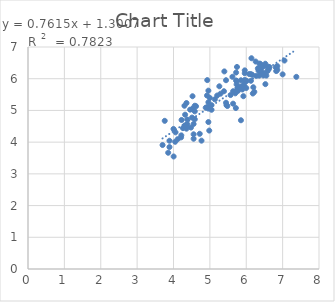
| Category | Series 0 |
|---|---|
| 4.301 | 5.148 |
| 5.77 | 5.615 |
| 5.939 | 5.781 |
| 6.824 | 6.241 |
| 5.569 | 5.485 |
| 6.387 | 6.465 |
| 6.276 | 6.089 |
| 5.959 | 6.173 |
| 5.0 | 5.393 |
| 6.0 | 5.707 |
| 5.201 | 5.469 |
| 5.444 | 5.952 |
| 4.319 | 4.866 |
| 6.167 | 6.121 |
| 5.638 | 5.605 |
| 6.409 | 6.189 |
| 6.502 | 6.173 |
| 6.131 | 6.143 |
| 7.377 | 6.059 |
| 7.0 | 6.137 |
| 6.854 | 6.279 |
| 6.81 | 6.358 |
| 4.357 | 5.234 |
| 4.959 | 5.623 |
| 6.523 | 6.472 |
| 5.721 | 5.944 |
| 6.357 | 6.096 |
| 4.62 | 5.132 |
| 5.699 | 5.539 |
| 6.337 | 6.253 |
| 6.553 | 6.098 |
| 6.319 | 6.327 |
| 5.836 | 5.752 |
| 5.714 | 5.075 |
| 5.893 | 5.661 |
| 4.983 | 4.365 |
| 5.757 | 5.705 |
| 5.735 | 5.819 |
| 6.129 | 5.935 |
| 6.526 | 5.829 |
| 5.959 | 5.889 |
| 4.529 | 5.061 |
| 5.735 | 5.927 |
| 6.081 | 6.147 |
| 6.638 | 6.368 |
| 6.367 | 6.476 |
| 6.398 | 6.431 |
| 7.051 | 6.573 |
| 5.292 | 5.527 |
| 6.222 | 5.585 |
| 6.602 | 6.38 |
| 4.959 | 5.258 |
| 4.921 | 5.47 |
| 6.26 | 6.541 |
| 4.936 | 5.112 |
| 5.638 | 5.213 |
| 4.959 | 5.058 |
| 4.77 | 4.047 |
| 4.509 | 4.774 |
| 4.585 | 5.148 |
| 4.114 | 4.093 |
| 4.046 | 4.011 |
| 3.699 | 3.909 |
| 4.056 | 4.309 |
| 4.886 | 5.088 |
| 4.456 | 5.025 |
| 5.854 | 4.69 |
| 5.456 | 5.168 |
| 5.481 | 5.139 |
| 5.046 | 5.166 |
| 4.523 | 5.036 |
| 4.31 | 4.528 |
| 3.759 | 4.672 |
| 4.721 | 4.263 |
| 4.553 | 4.107 |
| 3.889 | 3.845 |
| 4.004 | 3.548 |
| 4.215 | 4.213 |
| 4.357 | 4.424 |
| 3.889 | 4.044 |
| 4.553 | 4.247 |
| 4.585 | 4.721 |
| 6.013 | 5.933 |
| 5.854 | 5.95 |
| 4.928 | 5.956 |
| 5.745 | 6.371 |
| 5.26 | 5.761 |
| 6.18 | 5.534 |
| 5.444 | 5.242 |
| 6.194 | 5.731 |
| 5.62 | 6.061 |
| 4.377 | 4.715 |
| 3.854 | 3.666 |
| 4.222 | 4.699 |
| 4.553 | 4.573 |
| 5.745 | 5.634 |
| 4.377 | 4.569 |
| 4.959 | 4.634 |
| 4.481 | 4.461 |
| 4.523 | 5.447 |
| 4.208 | 4.15 |
| 5.046 | 5.02 |
| 4.26 | 4.442 |
| 6.469 | 6.101 |
| 5.921 | 5.449 |
| 6.143 | 6.646 |
| 6.854 | 6.397 |
| 6.62 | 6.303 |
| 5.959 | 6.264 |
| 5.398 | 6.23 |
| 6.495 | 6.394 |
| 5.721 | 6.195 |
| 6.456 | 6.395 |
| 6.585 | 6.24 |
| 6.409 | 6.265 |
| 5.959 | 5.962 |
| 5.387 | 5.605 |
| 5.921 | 5.796 |
| 4.357 | 4.469 |
| 4.0 | 4.416 |
| 4.585 | 4.971 |
| 5.137 | 5.349 |